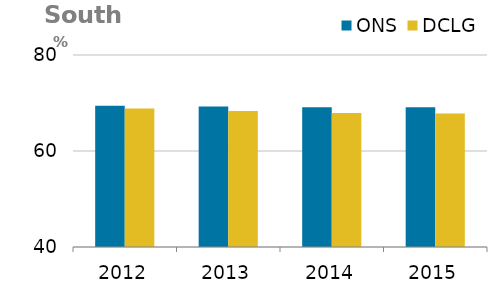
| Category | ONS | DCLG |
|---|---|---|
| 0 | 69.45 | 68.857 |
| 1 | 69.28 | 68.337 |
| 2 | 69.14 | 67.912 |
| 3 | 69.13 | 67.808 |